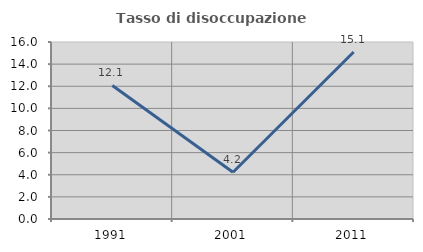
| Category | Tasso di disoccupazione giovanile  |
|---|---|
| 1991.0 | 12.069 |
| 2001.0 | 4.225 |
| 2011.0 | 15.094 |